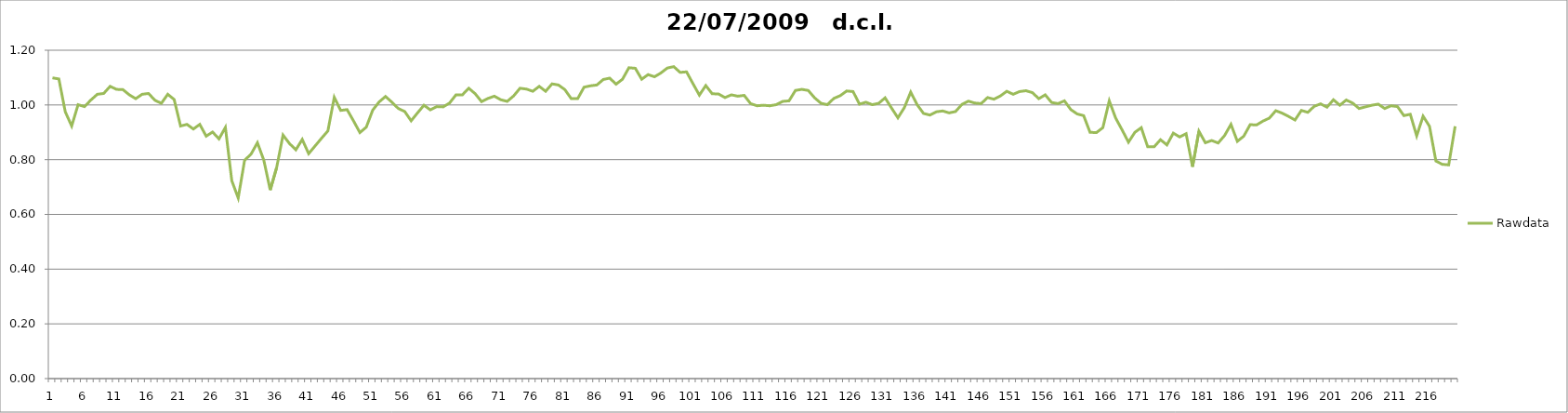
| Category | Rawdata |
|---|---|
| 0 | 1.099 |
| 1 | 1.095 |
| 2 | 0.975 |
| 3 | 0.923 |
| 4 | 1.001 |
| 5 | 0.994 |
| 6 | 1.018 |
| 7 | 1.039 |
| 8 | 1.042 |
| 9 | 1.068 |
| 10 | 1.057 |
| 11 | 1.056 |
| 12 | 1.037 |
| 13 | 1.023 |
| 14 | 1.039 |
| 15 | 1.042 |
| 16 | 1.017 |
| 17 | 1.006 |
| 18 | 1.039 |
| 19 | 1.02 |
| 20 | 0.923 |
| 21 | 0.929 |
| 22 | 0.912 |
| 23 | 0.929 |
| 24 | 0.886 |
| 25 | 0.901 |
| 26 | 0.876 |
| 27 | 0.918 |
| 28 | 0.723 |
| 29 | 0.66 |
| 30 | 0.798 |
| 31 | 0.82 |
| 32 | 0.862 |
| 33 | 0.798 |
| 34 | 0.689 |
| 35 | 0.771 |
| 36 | 0.89 |
| 37 | 0.859 |
| 38 | 0.836 |
| 39 | 0.874 |
| 40 | 0.822 |
| 41 | 0.85 |
| 42 | 0.878 |
| 43 | 0.905 |
| 44 | 1.028 |
| 45 | 0.98 |
| 46 | 0.983 |
| 47 | 0.942 |
| 48 | 0.899 |
| 49 | 0.919 |
| 50 | 0.981 |
| 51 | 1.011 |
| 52 | 1.031 |
| 53 | 1.01 |
| 54 | 0.987 |
| 55 | 0.976 |
| 56 | 0.942 |
| 57 | 0.971 |
| 58 | 0.999 |
| 59 | 0.982 |
| 60 | 0.994 |
| 61 | 0.993 |
| 62 | 1.007 |
| 63 | 1.037 |
| 64 | 1.037 |
| 65 | 1.061 |
| 66 | 1.041 |
| 67 | 1.012 |
| 68 | 1.024 |
| 69 | 1.032 |
| 70 | 1.019 |
| 71 | 1.013 |
| 72 | 1.033 |
| 73 | 1.061 |
| 74 | 1.058 |
| 75 | 1.05 |
| 76 | 1.068 |
| 77 | 1.05 |
| 78 | 1.077 |
| 79 | 1.073 |
| 80 | 1.056 |
| 81 | 1.023 |
| 82 | 1.023 |
| 83 | 1.065 |
| 84 | 1.07 |
| 85 | 1.073 |
| 86 | 1.093 |
| 87 | 1.098 |
| 88 | 1.076 |
| 89 | 1.094 |
| 90 | 1.136 |
| 91 | 1.134 |
| 92 | 1.094 |
| 93 | 1.111 |
| 94 | 1.103 |
| 95 | 1.117 |
| 96 | 1.135 |
| 97 | 1.14 |
| 98 | 1.119 |
| 99 | 1.121 |
| 100 | 1.078 |
| 101 | 1.036 |
| 102 | 1.071 |
| 103 | 1.041 |
| 104 | 1.04 |
| 105 | 1.027 |
| 106 | 1.037 |
| 107 | 1.032 |
| 108 | 1.035 |
| 109 | 1.005 |
| 110 | 0.997 |
| 111 | 0.999 |
| 112 | 0.997 |
| 113 | 1.001 |
| 114 | 1.013 |
| 115 | 1.015 |
| 116 | 1.053 |
| 117 | 1.057 |
| 118 | 1.053 |
| 119 | 1.026 |
| 120 | 1.006 |
| 121 | 1.001 |
| 122 | 1.024 |
| 123 | 1.034 |
| 124 | 1.051 |
| 125 | 1.049 |
| 126 | 1.003 |
| 127 | 1.01 |
| 128 | 1.001 |
| 129 | 1.006 |
| 130 | 1.026 |
| 131 | 0.989 |
| 132 | 0.953 |
| 133 | 0.99 |
| 134 | 1.047 |
| 135 | 1.001 |
| 136 | 0.969 |
| 137 | 0.963 |
| 138 | 0.975 |
| 139 | 0.978 |
| 140 | 0.971 |
| 141 | 0.976 |
| 142 | 1.002 |
| 143 | 1.014 |
| 144 | 1.007 |
| 145 | 1.005 |
| 146 | 1.027 |
| 147 | 1.021 |
| 148 | 1.033 |
| 149 | 1.05 |
| 150 | 1.039 |
| 151 | 1.049 |
| 152 | 1.052 |
| 153 | 1.045 |
| 154 | 1.023 |
| 155 | 1.037 |
| 156 | 1.009 |
| 157 | 1.005 |
| 158 | 1.015 |
| 159 | 0.983 |
| 160 | 0.967 |
| 161 | 0.961 |
| 162 | 0.9 |
| 163 | 0.899 |
| 164 | 0.917 |
| 165 | 1.015 |
| 166 | 0.952 |
| 167 | 0.909 |
| 168 | 0.864 |
| 169 | 0.9 |
| 170 | 0.917 |
| 171 | 0.847 |
| 172 | 0.847 |
| 173 | 0.873 |
| 174 | 0.854 |
| 175 | 0.897 |
| 176 | 0.883 |
| 177 | 0.895 |
| 178 | 0.774 |
| 179 | 0.904 |
| 180 | 0.862 |
| 181 | 0.87 |
| 182 | 0.861 |
| 183 | 0.888 |
| 184 | 0.929 |
| 185 | 0.867 |
| 186 | 0.886 |
| 187 | 0.928 |
| 188 | 0.927 |
| 189 | 0.941 |
| 190 | 0.952 |
| 191 | 0.979 |
| 192 | 0.97 |
| 193 | 0.958 |
| 194 | 0.945 |
| 195 | 0.98 |
| 196 | 0.973 |
| 197 | 0.995 |
| 198 | 1.004 |
| 199 | 0.992 |
| 200 | 1.019 |
| 201 | 0.999 |
| 202 | 1.018 |
| 203 | 1.007 |
| 204 | 0.987 |
| 205 | 0.993 |
| 206 | 0.999 |
| 207 | 1.003 |
| 208 | 0.987 |
| 209 | 0.997 |
| 210 | 0.994 |
| 211 | 0.961 |
| 212 | 0.966 |
| 213 | 0.887 |
| 214 | 0.959 |
| 215 | 0.922 |
| 216 | 0.795 |
| 217 | 0.783 |
| 218 | 0.781 |
| 219 | 0.922 |